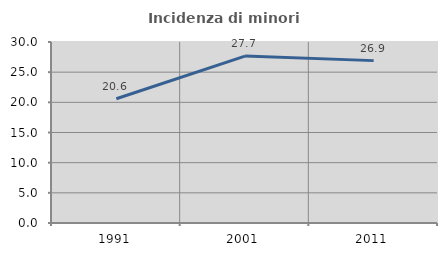
| Category | Incidenza di minori stranieri |
|---|---|
| 1991.0 | 20.588 |
| 2001.0 | 27.67 |
| 2011.0 | 26.913 |